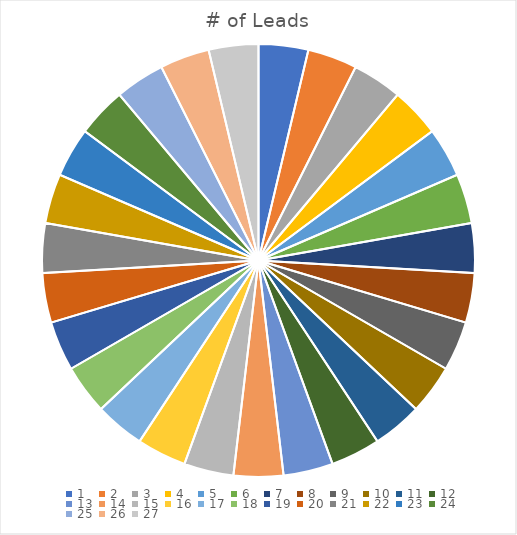
| Category | # of Leads |
|---|---|
| 0 | 1 |
| 1 | 1 |
| 2 | 1 |
| 3 | 1 |
| 4 | 1 |
| 5 | 1 |
| 6 | 1 |
| 7 | 1 |
| 8 | 1 |
| 9 | 1 |
| 10 | 1 |
| 11 | 1 |
| 12 | 1 |
| 13 | 1 |
| 14 | 1 |
| 15 | 1 |
| 16 | 1 |
| 17 | 1 |
| 18 | 1 |
| 19 | 1 |
| 20 | 1 |
| 21 | 1 |
| 22 | 1 |
| 23 | 1 |
| 24 | 1 |
| 25 | 1 |
| 26 | 1 |